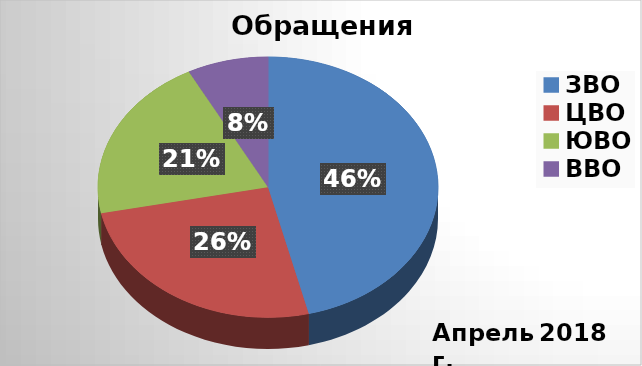
| Category | Series 0 |
|---|---|
| ЗВО | 18 |
| ЦВО | 10 |
| ЮВО | 8 |
| ВВО | 3 |